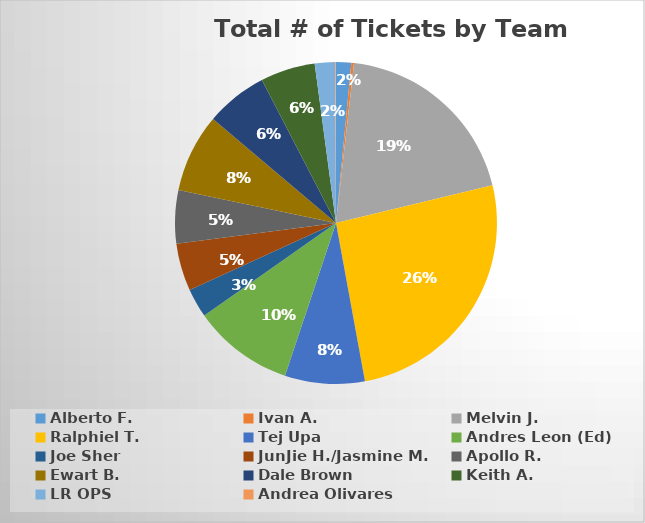
| Category | Series 0 |
|---|---|
| Alberto F. | 0.015 |
| Ivan A. | 0.003 |
| Melvin J. | 0.195 |
| Ralphiel T. | 0.259 |
| Tej Upa | 0.08 |
| Andres Leon (Ed) | 0.101 |
| Joe Sher | 0.029 |
| JunJie H./Jasmine M. | 0.048 |
| Apollo R. | 0.054 |
| Ewart B. | 0.079 |
| Dale Brown | 0.062 |
| Keith A. | 0.055 |
| LR OPS | 0.021 |
| Andrea Olivares | 0.001 |